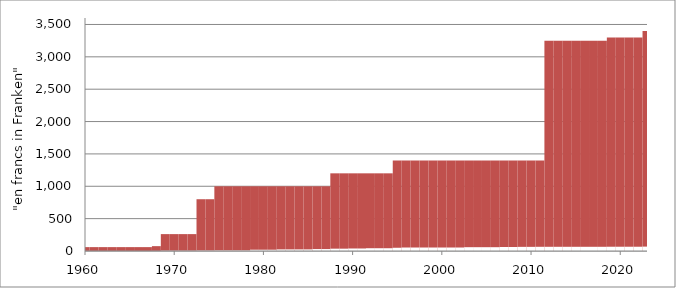
| Category | Personnes sans activité lucrative |
|---|---|
| 1960 | 1.2 |
| 1961 | 1.2 |
| 1962 | 1.2 |
| 1963 | 1.2 |
| 1964 | 1.2 |
| 1965 | 1.2 |
| 1966 | 1.2 |
| 1967 | 1.2 |
| 1968 | 1.8 |
| 1969 | 5.6 |
| 1970 | 5.6 |
| 1971 | 5.6 |
| 1972 | 5.6 |
| 1973 | 8 |
| 1974 | 8 |
| 1975 | 10 |
| 1976 | 10 |
| 1977 | 10 |
| 1978 | 10 |
| 1979 | 20 |
| 1980 | 20 |
| 1981 | 20 |
| 1982 | 25 |
| 1983 | 25 |
| 1984 | 25 |
| 1985 | 25 |
| 1986 | 30 |
| 1987 | 30 |
| 1988 | 36 |
| 1989 | 36 |
| 1990 | 39 |
| 1991 | 39 |
| 1992 | 43 |
| 1993 | 43 |
| 1994 | 43 |
| 1995 | 50 |
| 1996 | 54 |
| 1997 | 54 |
| 1998 | 54 |
| 1999 | 54 |
| 2000 | 54 |
| 2001 | 54 |
| 2002 | 54 |
| 2003 | 59 |
| 2004 | 59 |
| 2005 | 59 |
| 2006 | 59 |
| 2007 | 62 |
| 2008 | 62 |
| 2009 | 64 |
| 2010 | 64 |
| 2011 | 65 |
| 2012 | 65 |
| 2013 | 65 |
| 2014 | 65 |
| 2015 | 65 |
| 2016 | 65 |
| 2017 | 65 |
| 2018 | 65 |
| 2019 | 66 |
| 2020 | 66 |
| 2021 | 66 |
| 2022 | 66 |
| 2023 | 68 |